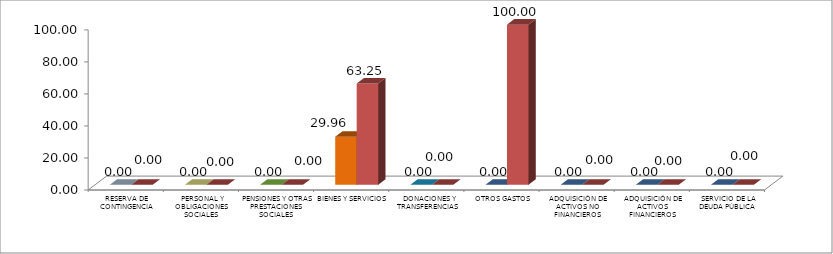
| Category | 1er Trimestre | 2do Trimestre |
|---|---|---|
|  RESERVA DE CONTINGENCIA | 0 | 0 |
|  PERSONAL Y OBLIGACIONES SOCIALES | 0 | 0 |
|  PENSIONES Y OTRAS PRESTACIONES SOCIALES | 0 | 0 |
|  BIENES Y SERVICIOS | 29.964 | 63.246 |
|   DONACIONES Y TRANSFERENCIAS | 0 | 0 |
|  OTROS GASTOS | 0 | 100 |
|  ADQUISICIÓN DE ACTIVOS NO FINANCIEROS | 0 | 0 |
|  ADQUISICIÓN DE ACTIVOS FINANCIEROS | 0 | 0 |
|  SERVICIO DE LA DEUDA PÚBLICA | 0 | 0 |